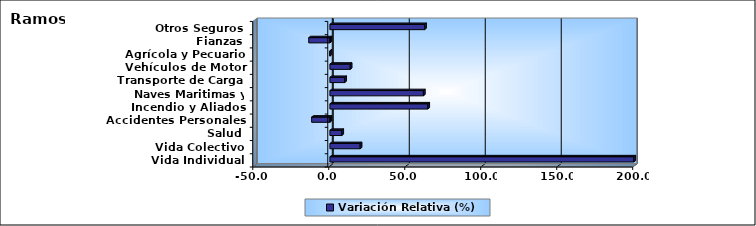
| Category | Variación Relativa (%) |
|---|---|
| Vida Individual | 199.981 |
| Vida Colectivo | 19.901 |
| Salud | 7.827 |
| Accidentes Personales | -12.005 |
| Incendio y Aliados | 64.402 |
| Naves Maritimas y Aéreas | 61.518 |
| Transporte de Carga | 9.704 |
| Vehículos de Motor | 13.366 |
| Agrícola y Pecuario | 0.04 |
| Fianzas | -13.917 |
| Otros Seguros | 62.303 |